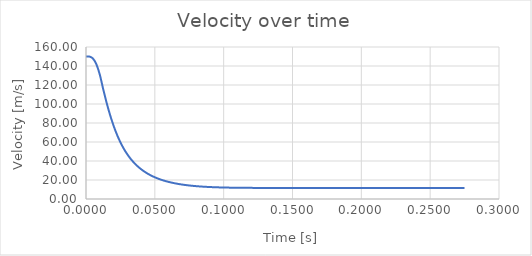
| Category | Series 0 |
|---|---|
| 0.0 | 150 |
| 0.0025 | 149.971 |
| 0.005 | 147.901 |
| 0.0075 | 141.948 |
| 0.01 | 131.039 |
| 0.0125 | 115.596 |
| 0.015000000000000001 | 101.207 |
| 0.0175 | 88.379 |
| 0.02 | 77.245 |
| 0.0225 | 67.728 |
| 0.024999999999999998 | 59.656 |
| 0.027499999999999997 | 52.827 |
| 0.029999999999999995 | 47.049 |
| 0.032499999999999994 | 42.149 |
| 0.034999999999999996 | 37.982 |
| 0.0375 | 34.426 |
| 0.04 | 31.38 |
| 0.0425 | 28.761 |
| 0.045000000000000005 | 26.502 |
| 0.04750000000000001 | 24.548 |
| 0.05000000000000001 | 22.853 |
| 0.05250000000000001 | 21.379 |
| 0.055000000000000014 | 20.095 |
| 0.057500000000000016 | 18.975 |
| 0.06000000000000002 | 17.996 |
| 0.06250000000000001 | 17.141 |
| 0.06500000000000002 | 16.393 |
| 0.06750000000000002 | 15.739 |
| 0.07000000000000002 | 15.168 |
| 0.07250000000000002 | 14.669 |
| 0.07500000000000002 | 14.234 |
| 0.07750000000000003 | 13.855 |
| 0.08000000000000003 | 13.526 |
| 0.08250000000000003 | 13.24 |
| 0.08500000000000003 | 12.993 |
| 0.08750000000000004 | 12.78 |
| 0.09000000000000004 | 12.596 |
| 0.09250000000000004 | 12.439 |
| 0.09500000000000004 | 12.305 |
| 0.09750000000000004 | 12.19 |
| 0.10000000000000005 | 12.093 |
| 0.10250000000000005 | 12.011 |
| 0.10500000000000005 | 11.942 |
| 0.10750000000000005 | 11.884 |
| 0.11000000000000006 | 11.836 |
| 0.11250000000000006 | 11.797 |
| 0.11500000000000006 | 11.764 |
| 0.11750000000000006 | 11.737 |
| 0.12000000000000006 | 11.715 |
| 0.12250000000000007 | 11.697 |
| 0.12500000000000006 | 11.682 |
| 0.12750000000000006 | 11.671 |
| 0.13000000000000006 | 11.661 |
| 0.13250000000000006 | 11.654 |
| 0.13500000000000006 | 11.648 |
| 0.13750000000000007 | 11.643 |
| 0.14000000000000007 | 11.64 |
| 0.14250000000000007 | 11.637 |
| 0.14500000000000007 | 11.635 |
| 0.14750000000000008 | 11.633 |
| 0.15000000000000008 | 11.632 |
| 0.15250000000000008 | 11.631 |
| 0.15500000000000008 | 11.63 |
| 0.15750000000000008 | 11.629 |
| 0.1600000000000001 | 11.629 |
| 0.1625000000000001 | 11.629 |
| 0.1650000000000001 | 11.628 |
| 0.1675000000000001 | 11.628 |
| 0.1700000000000001 | 11.628 |
| 0.1725000000000001 | 11.628 |
| 0.1750000000000001 | 11.628 |
| 0.1775000000000001 | 11.628 |
| 0.1800000000000001 | 11.628 |
| 0.1825000000000001 | 11.628 |
| 0.1850000000000001 | 11.628 |
| 0.1875000000000001 | 11.628 |
| 0.1900000000000001 | 11.628 |
| 0.19250000000000012 | 11.628 |
| 0.19500000000000012 | 11.628 |
| 0.19750000000000012 | 11.628 |
| 0.20000000000000012 | 11.628 |
| 0.20250000000000012 | 11.628 |
| 0.20500000000000013 | 11.628 |
| 0.20750000000000013 | 11.628 |
| 0.21000000000000013 | 11.628 |
| 0.21250000000000013 | 11.628 |
| 0.21500000000000014 | 11.627 |
| 0.21750000000000014 | 11.627 |
| 0.22000000000000014 | 11.627 |
| 0.22250000000000014 | 11.627 |
| 0.22500000000000014 | 11.627 |
| 0.22750000000000015 | 11.627 |
| 0.23000000000000015 | 11.627 |
| 0.23250000000000015 | 11.627 |
| 0.23500000000000015 | 11.627 |
| 0.23750000000000016 | 11.627 |
| 0.24000000000000016 | 11.627 |
| 0.24250000000000016 | 11.627 |
| 0.24500000000000016 | 11.627 |
| 0.24750000000000016 | 11.627 |
| 0.25000000000000017 | 11.627 |
| 0.25250000000000017 | 11.627 |
| 0.25500000000000017 | 11.627 |
| 0.2575000000000002 | 11.627 |
| 0.2600000000000002 | 11.627 |
| 0.2625000000000002 | 11.627 |
| 0.2650000000000002 | 11.627 |
| 0.2675000000000002 | 11.627 |
| 0.2700000000000002 | 11.627 |
| 0.2725000000000002 | 11.627 |
| 0.2750000000000002 | 11.627 |